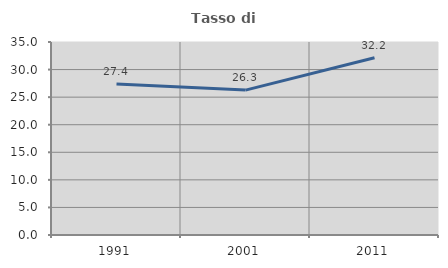
| Category | Tasso di occupazione   |
|---|---|
| 1991.0 | 27.379 |
| 2001.0 | 26.276 |
| 2011.0 | 32.153 |